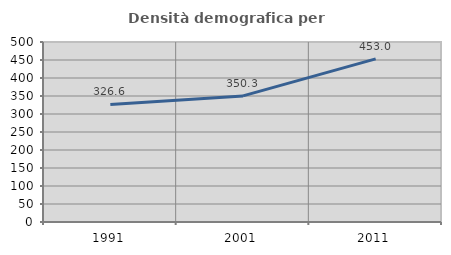
| Category | Densità demografica |
|---|---|
| 1991.0 | 326.635 |
| 2001.0 | 350.276 |
| 2011.0 | 453.043 |